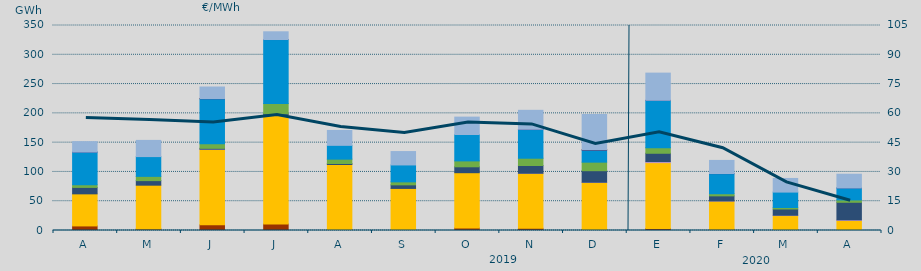
| Category | Carbón | Ciclo Combinado | Cogeneración | Consumo Bombeo | Eólica | Hidráulica | Nuclear | Otras Renovables | Solar fotovoltaica | Turbinación bombeo |
|---|---|---|---|---|---|---|---|---|---|---|
| A | 7813.1 | 54755.9 | 0 | 11010.9 | 4506.1 | 55784.8 | 149.4 | 0 | 0 | 17672.7 |
| M | 2747.5 | 74607.7 | 0 | 7818.6 | 7248.2 | 33753.6 | 0 | 0 | 0 | 27655 |
| J | 9630 | 128693.8 | 467.1 | 1487.8 | 7835.7 | 76799.4 | 366 | 20 | 0 | 19680.5 |
| J | 11017.4 | 186524.2 | 300.4 | 1392.5 | 17639.5 | 109155.5 | 60 | 0 | 0 | 13153.1 |
| A | 1459.4 | 111215 | 0 | 1733.4 | 7402.2 | 23588.2 | 0 | 0 | 0 | 25429.5 |
| S | 311.6 | 71523.4 | 0 | 6112.7 | 5081.7 | 28895.9 | 0 | 0 | 0 | 22840.2 |
| O | 4163.7 | 94511.7 | 0 | 10093.2 | 10069.8 | 45049.8 | 0 | 0 | 0 | 29699 |
| N | 3677.8 | 93991.4 | 51.5 | 13298.4 | 12383 | 48971.8 | 539 | 0 | 0 | 32260 |
| D | 1607.3 | 80390.7 | 371.4 | 19733.1 | 14568.3 | 20541.3 | 876.4 | 0 | 1.2 | 60128.2 |
| E | 3376.2 | 112471.6 | 1718.3 | 14293.3 | 9539.1 | 80742.1 | 186 | 0 | 0 | 46371.3 |
| F | 1995 | 48257.3 | 169 | 8732.4 | 3606.8 | 34283.3 | 267 | 0 | 0 | 22347.8 |
| M | 418.1 | 25069.8 | 511.6 | 10680.8 | 2598.7 | 26299.3 | 0 | 0 | 0 | 23301.1 |
| A | 0 | 17020 | 1099 | 30032 | 4029 | 20482 | 12 | 0 | 0 | 23437 |